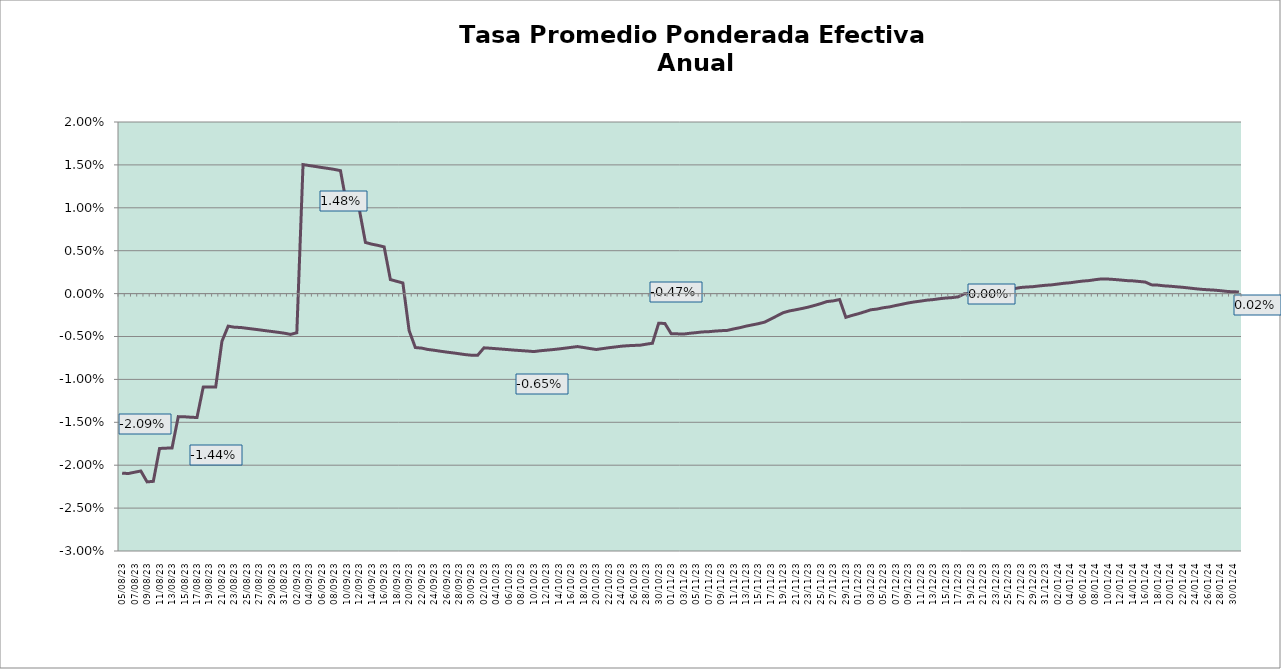
| Category | TEA |
|---|---|
| 2023-08-05 | -0.021 |
| 2023-08-06 | -0.021 |
| 2023-08-07 | -0.021 |
| 2023-08-08 | -0.021 |
| 2023-08-09 | -0.022 |
| 2023-08-10 | -0.022 |
| 2023-08-11 | -0.018 |
| 2023-08-12 | -0.018 |
| 2023-08-13 | -0.018 |
| 2023-08-14 | -0.014 |
| 2023-08-15 | -0.014 |
| 2023-08-16 | -0.014 |
| 2023-08-17 | -0.014 |
| 2023-08-18 | -0.011 |
| 2023-08-19 | -0.011 |
| 2023-08-20 | -0.011 |
| 2023-08-21 | -0.006 |
| 2023-08-22 | -0.004 |
| 2023-08-23 | -0.004 |
| 2023-08-24 | -0.004 |
| 2023-08-25 | -0.004 |
| 2023-08-26 | -0.004 |
| 2023-08-27 | -0.004 |
| 2023-08-28 | -0.004 |
| 2023-08-29 | -0.004 |
| 2023-08-30 | -0.005 |
| 2023-08-31 | -0.005 |
| 2023-09-01 | -0.005 |
| 2023-09-02 | -0.005 |
| 2023-09-03 | 0.015 |
| 2023-09-04 | 0.015 |
| 2023-09-05 | 0.015 |
| 2023-09-06 | 0.015 |
| 2023-09-07 | 0.015 |
| 2023-09-08 | 0.014 |
| 2023-09-09 | 0.014 |
| 2023-09-10 | 0.01 |
| 2023-09-11 | 0.01 |
| 2023-09-12 | 0.01 |
| 2023-09-13 | 0.006 |
| 2023-09-14 | 0.006 |
| 2023-09-15 | 0.006 |
| 2023-09-16 | 0.005 |
| 2023-09-17 | 0.002 |
| 2023-09-18 | 0.001 |
| 2023-09-19 | 0.001 |
| 2023-09-20 | -0.004 |
| 2023-09-21 | -0.006 |
| 2023-09-22 | -0.006 |
| 2023-09-23 | -0.007 |
| 2023-09-24 | -0.007 |
| 2023-09-25 | -0.007 |
| 2023-09-26 | -0.007 |
| 2023-09-27 | -0.007 |
| 2023-09-28 | -0.007 |
| 2023-09-29 | -0.007 |
| 2023-09-30 | -0.007 |
| 2023-10-01 | -0.007 |
| 2023-10-02 | -0.006 |
| 2023-10-03 | -0.006 |
| 2023-10-04 | -0.006 |
| 2023-10-05 | -0.006 |
| 2023-10-06 | -0.007 |
| 2023-10-07 | -0.007 |
| 2023-10-08 | -0.007 |
| 2023-10-09 | -0.007 |
| 2023-10-10 | -0.007 |
| 2023-10-11 | -0.007 |
| 2023-10-12 | -0.007 |
| 2023-10-13 | -0.007 |
| 2023-10-14 | -0.006 |
| 2023-10-15 | -0.006 |
| 2023-10-16 | -0.006 |
| 2023-10-17 | -0.006 |
| 2023-10-18 | -0.006 |
| 2023-10-19 | -0.006 |
| 2023-10-20 | -0.007 |
| 2023-10-21 | -0.006 |
| 2023-10-22 | -0.006 |
| 2023-10-23 | -0.006 |
| 2023-10-24 | -0.006 |
| 2023-10-25 | -0.006 |
| 2023-10-26 | -0.006 |
| 2023-10-27 | -0.006 |
| 2023-10-28 | -0.006 |
| 2023-10-29 | -0.006 |
| 2023-10-30 | -0.003 |
| 2023-10-31 | -0.003 |
| 2023-11-01 | -0.005 |
| 2023-11-02 | -0.005 |
| 2023-11-03 | -0.005 |
| 2023-11-04 | -0.005 |
| 2023-11-05 | -0.005 |
| 2023-11-06 | -0.004 |
| 2023-11-07 | -0.004 |
| 2023-11-08 | -0.004 |
| 2023-11-09 | -0.004 |
| 2023-11-10 | -0.004 |
| 2023-11-11 | -0.004 |
| 2023-11-12 | -0.004 |
| 2023-11-13 | -0.004 |
| 2023-11-14 | -0.004 |
| 2023-11-15 | -0.004 |
| 2023-11-16 | -0.003 |
| 2023-11-17 | -0.003 |
| 2023-11-18 | -0.003 |
| 2023-11-19 | -0.002 |
| 2023-11-20 | -0.002 |
| 2023-11-21 | -0.002 |
| 2023-11-22 | -0.002 |
| 2023-11-23 | -0.002 |
| 2023-11-24 | -0.001 |
| 2023-11-25 | -0.001 |
| 2023-11-26 | -0.001 |
| 2023-11-27 | -0.001 |
| 2023-11-28 | -0.001 |
| 2023-11-29 | -0.003 |
| 2023-11-30 | -0.003 |
| 2023-12-01 | -0.002 |
| 2023-12-02 | -0.002 |
| 2023-12-03 | -0.002 |
| 2023-12-04 | -0.002 |
| 2023-12-05 | -0.002 |
| 2023-12-06 | -0.002 |
| 2023-12-07 | -0.001 |
| 2023-12-08 | -0.001 |
| 2023-12-09 | -0.001 |
| 2023-12-10 | -0.001 |
| 2023-12-11 | -0.001 |
| 2023-12-12 | -0.001 |
| 2023-12-13 | -0.001 |
| 2023-12-14 | -0.001 |
| 2023-12-15 | -0.001 |
| 2023-12-16 | 0 |
| 2023-12-17 | 0 |
| 2023-12-18 | 0 |
| 2023-12-19 | 0 |
| 2023-12-20 | 0 |
| 2023-12-21 | 0 |
| 2023-12-22 | 0 |
| 2023-12-23 | 0 |
| 2023-12-24 | 0 |
| 2023-12-25 | 0.001 |
| 2023-12-26 | 0.001 |
| 2023-12-27 | 0.001 |
| 2023-12-28 | 0.001 |
| 2023-12-29 | 0.001 |
| 2023-12-30 | 0.001 |
| 2023-12-31 | 0.001 |
| 2024-01-01 | 0.001 |
| 2024-01-02 | 0.001 |
| 2024-01-03 | 0.001 |
| 2024-01-04 | 0.001 |
| 2024-01-05 | 0.001 |
| 2024-01-06 | 0.001 |
| 2024-01-07 | 0.002 |
| 2024-01-08 | 0.002 |
| 2024-01-09 | 0.002 |
| 2024-01-10 | 0.002 |
| 2024-01-11 | 0.002 |
| 2024-01-12 | 0.002 |
| 2024-01-13 | 0.002 |
| 2024-01-14 | 0.001 |
| 2024-01-15 | 0.001 |
| 2024-01-16 | 0.001 |
| 2024-01-17 | 0.001 |
| 2024-01-18 | 0.001 |
| 2024-01-19 | 0.001 |
| 2024-01-20 | 0.001 |
| 2024-01-21 | 0.001 |
| 2024-01-22 | 0.001 |
| 2024-01-23 | 0.001 |
| 2024-01-24 | 0.001 |
| 2024-01-25 | 0 |
| 2024-01-26 | 0 |
| 2024-01-27 | 0 |
| 2024-01-28 | 0 |
| 2024-01-29 | 0 |
| 2024-01-30 | 0 |
| 2024-01-31 | 0 |